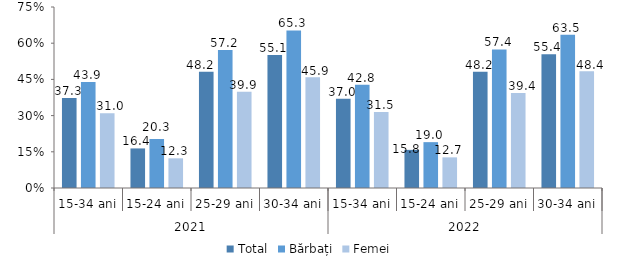
| Category | Total | Bărbați | Femei |
|---|---|---|---|
| 0 | 37.3 | 43.9 | 31 |
| 1 | 16.4 | 20.3 | 12.3 |
| 2 | 48.2 | 57.2 | 39.9 |
| 3 | 55.1 | 65.3 | 45.9 |
| 4 | 37 | 42.8 | 31.5 |
| 5 | 15.8 | 19 | 12.7 |
| 6 | 48.2 | 57.4 | 39.4 |
| 7 | 55.4 | 63.5 | 48.4 |